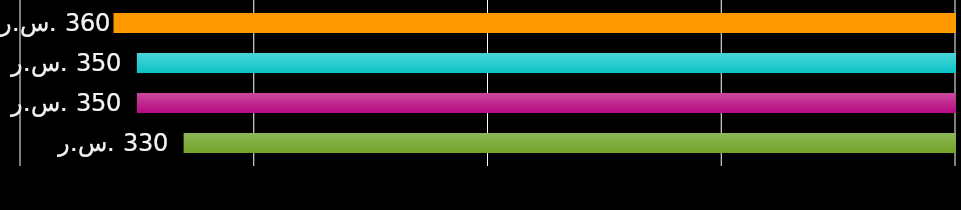
| Category | شريك السكن 1 | شريك السكن 2 | شريك السكن 3 | شريك السكن 4 |
|---|---|---|---|---|
| 0 | 360 | 350 | 350 | 330 |